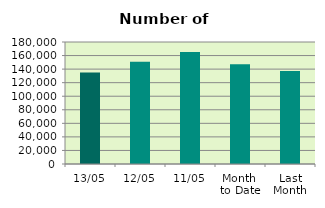
| Category | Series 0 |
|---|---|
| 13/05 | 134922 |
| 12/05 | 150840 |
| 11/05 | 165096 |
| Month 
to Date | 147171.778 |
| Last
Month | 137031.8 |